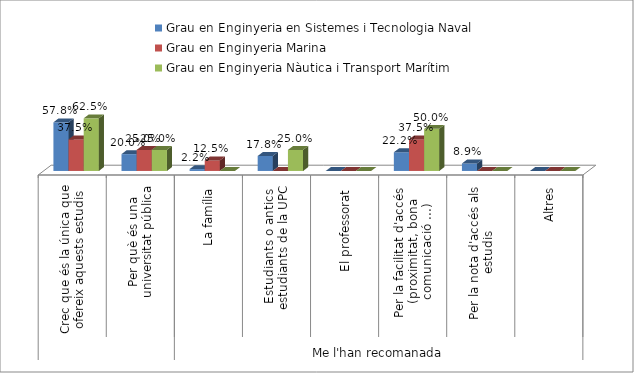
| Category | Grau en Enginyeria en Sistemes i Tecnologia Naval | Grau en Enginyeria Marina | Grau en Enginyeria Nàutica i Transport Marítim |
|---|---|---|---|
| 0 | 0.578 | 0.375 | 0.625 |
| 1 | 0.2 | 0.25 | 0.25 |
| 2 | 0.022 | 0.125 | 0 |
| 3 | 0.178 | 0 | 0.25 |
| 4 | 0 | 0 | 0 |
| 5 | 0.222 | 0.375 | 0.5 |
| 6 | 0.089 | 0 | 0 |
| 7 | 0 | 0 | 0 |